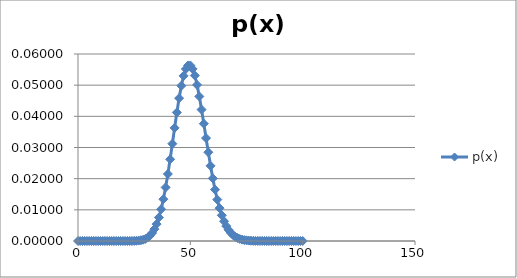
| Category | p(x) |
|---|---|
| 0.0 | 0 |
| 1.0 | 0 |
| 2.0 | 0 |
| 3.0 | 0 |
| 4.0 | 0 |
| 5.0 | 0 |
| 6.0 | 0 |
| 7.0 | 0 |
| 8.0 | 0 |
| 9.0 | 0 |
| 10.0 | 0 |
| 11.0 | 0 |
| 12.0 | 0 |
| 13.0 | 0 |
| 14.0 | 0 |
| 15.0 | 0 |
| 16.0 | 0 |
| 17.0 | 0 |
| 18.0 | 0 |
| 19.0 | 0 |
| 20.0 | 0 |
| 21.0 | 0 |
| 22.0 | 0 |
| 23.0 | 0 |
| 24.0 | 0 |
| 25.0 | 0 |
| 26.0 | 0 |
| 27.0 | 0 |
| 28.0 | 0 |
| 29.0 | 0 |
| 30.0 | 0.001 |
| 31.0 | 0.001 |
| 32.0 | 0.002 |
| 33.0 | 0.003 |
| 34.0 | 0.004 |
| 35.0 | 0.005 |
| 36.0 | 0.008 |
| 37.0 | 0.01 |
| 38.0 | 0.013 |
| 39.0 | 0.017 |
| 40.0 | 0.021 |
| 41.0 | 0.026 |
| 42.0 | 0.031 |
| 43.0 | 0.036 |
| 44.0 | 0.041 |
| 45.0 | 0.046 |
| 46.0 | 0.05 |
| 47.0 | 0.053 |
| 48.0 | 0.055 |
| 49.0 | 0.056 |
| 50.0 | 0.056 |
| 51.0 | 0.055 |
| 52.0 | 0.053 |
| 53.0 | 0.05 |
| 54.0 | 0.046 |
| 55.0 | 0.042 |
| 56.0 | 0.038 |
| 57.0 | 0.033 |
| 58.0 | 0.028 |
| 59.0 | 0.024 |
| 60.0 | 0.02 |
| 61.0 | 0.016 |
| 62.0 | 0.013 |
| 63.0 | 0.011 |
| 64.0 | 0.008 |
| 65.0 | 0.006 |
| 66.0 | 0.005 |
| 67.0 | 0.004 |
| 68.0 | 0.003 |
| 69.0 | 0.002 |
| 70.0 | 0.001 |
| 71.0 | 0.001 |
| 72.0 | 0.001 |
| 73.0 | 0 |
| 74.0 | 0 |
| 75.0 | 0 |
| 76.0 | 0 |
| 77.0 | 0 |
| 78.0 | 0 |
| 79.0 | 0 |
| 80.0 | 0 |
| 81.0 | 0 |
| 82.0 | 0 |
| 83.0 | 0 |
| 84.0 | 0 |
| 85.0 | 0 |
| 86.0 | 0 |
| 87.0 | 0 |
| 88.0 | 0 |
| 89.0 | 0 |
| 90.0 | 0 |
| 91.0 | 0 |
| 92.0 | 0 |
| 93.0 | 0 |
| 94.0 | 0 |
| 95.0 | 0 |
| 96.0 | 0 |
| 97.0 | 0 |
| 98.0 | 0 |
| 99.0 | 0 |
| 100.0 | 0 |